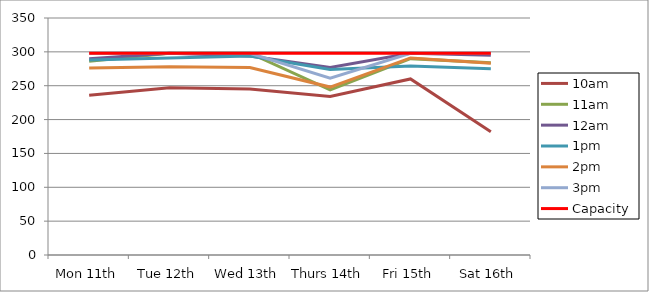
| Category | 9am | 10am | 11am | 12am | 1pm | 2pm | 3pm | 4pm | 5pm | Capacity |
|---|---|---|---|---|---|---|---|---|---|---|
| Mon 11th |  | 236 | 286 | 290 | 288 | 276 | 298 |  |  | 298 |
| Tue 12th |  | 247 | 298 | 298 | 291 | 278 | 298 |  |  | 298 |
| Wed 13th |  | 245 | 298 | 294 | 294 | 277 | 298 |  |  | 298 |
| Thurs 14th |  | 234 | 244 | 277 | 274 | 248 | 261 |  |  | 298 |
| Fri 15th |  | 260 | 290 | 298 | 279 | 291 | 298 |  |  | 298 |
| Sat 16th |  | 182 | 284 | 295 | 275 | 283 | 298 |  |  | 298 |